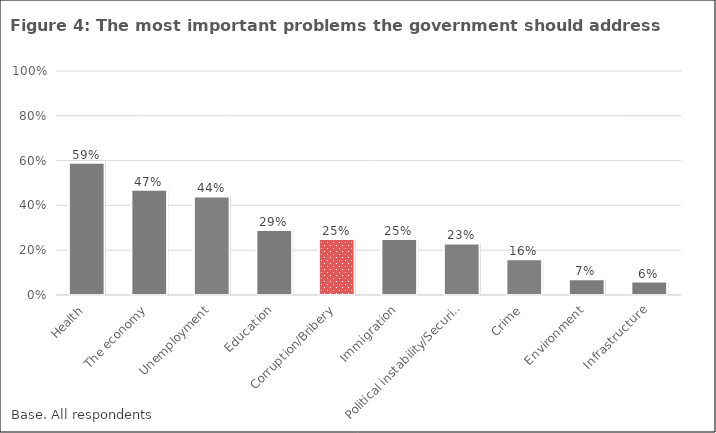
| Category | Series 0 |
|---|---|
| Health | 0.59 |
| The economy | 0.47 |
| Unemployment | 0.44 |
| Education | 0.29 |
| Corruption/Bribery | 0.25 |
| Immigration | 0.25 |
| Political instability/Security | 0.23 |
| Crime | 0.16 |
| Environment | 0.07 |
| Infrastructure | 0.06 |